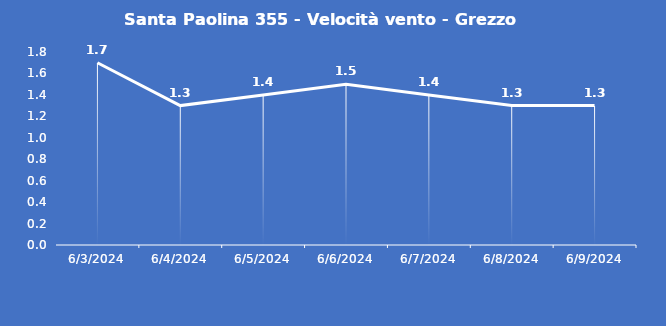
| Category | Santa Paolina 355 - Velocità vento - Grezzo (m/s) |
|---|---|
| 6/3/24 | 1.7 |
| 6/4/24 | 1.3 |
| 6/5/24 | 1.4 |
| 6/6/24 | 1.5 |
| 6/7/24 | 1.4 |
| 6/8/24 | 1.3 |
| 6/9/24 | 1.3 |